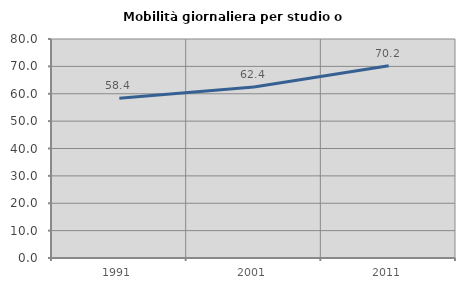
| Category | Mobilità giornaliera per studio o lavoro |
|---|---|
| 1991.0 | 58.368 |
| 2001.0 | 62.448 |
| 2011.0 | 70.212 |